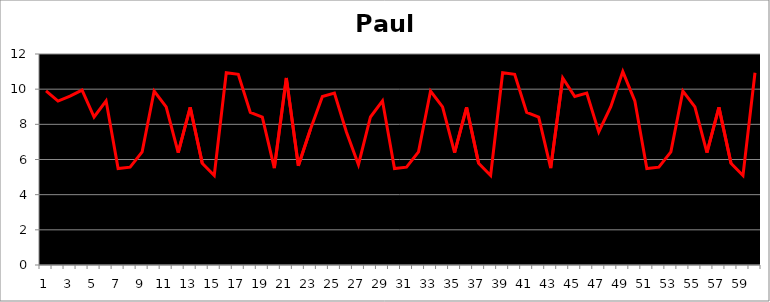
| Category | Paul |
|---|---|
| 0 | 9.902 |
| 1 | 9.322 |
| 2 | 9.6 |
| 3 | 9.944 |
| 4 | 8.417 |
| 5 | 9.337 |
| 6 | 5.489 |
| 7 | 5.565 |
| 8 | 6.432 |
| 9 | 9.893 |
| 10 | 8.993 |
| 11 | 6.393 |
| 12 | 8.961 |
| 13 | 5.791 |
| 14 | 5.09 |
| 15 | 10.935 |
| 16 | 10.843 |
| 17 | 8.674 |
| 18 | 8.41 |
| 19 | 5.507 |
| 20 | 10.637 |
| 21 | 5.641 |
| 22 | 7.706 |
| 23 | 9.586 |
| 24 | 9.777 |
| 25 | 7.569 |
| 26 | 5.705 |
| 27 | 8.417 |
| 28 | 9.337 |
| 29 | 5.489 |
| 30 | 5.565 |
| 31 | 6.432 |
| 32 | 9.893 |
| 33 | 8.993 |
| 34 | 6.393 |
| 35 | 8.961 |
| 36 | 5.791 |
| 37 | 5.09 |
| 38 | 10.935 |
| 39 | 10.843 |
| 40 | 8.674 |
| 41 | 8.41 |
| 42 | 5.507 |
| 43 | 10.637 |
| 44 | 9.586 |
| 45 | 9.777 |
| 46 | 7.569 |
| 47 | 9 |
| 48 | 11 |
| 49 | 9.337 |
| 50 | 5.489 |
| 51 | 5.565 |
| 52 | 6.432 |
| 53 | 9.893 |
| 54 | 8.993 |
| 55 | 6.393 |
| 56 | 8.961 |
| 57 | 5.791 |
| 58 | 5.09 |
| 59 | 10.935 |